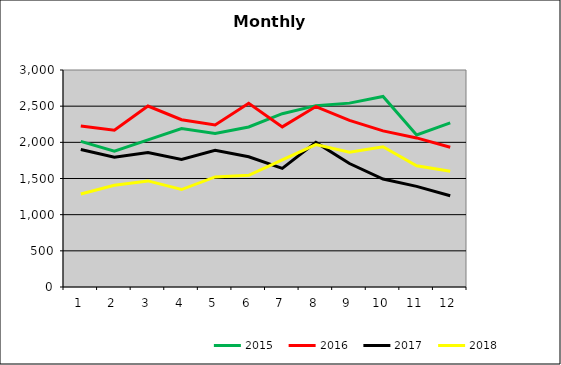
| Category | 2015 | 2016 | 2017 | 2018 |
|---|---|---|---|---|
| 0 | 2012.541 | 2226.188 | 1900.859 | 1286.21 |
| 1 | 1876.319 | 2166.497 | 1795.105 | 1406.556 |
| 2 | 2033.639 | 2501.903 | 1859.386 | 1466.695 |
| 3 | 2190.038 | 2312.349 | 1764.013 | 1347.408 |
| 4 | 2122.18 | 2240.561 | 1891.399 | 1522.181 |
| 5 | 2212.445 | 2540.235 | 1800.236 | 1543.945 |
| 6 | 2396.234 | 2213.485 | 1640.121 | 1758.013 |
| 7 | 2507.021 | 2494.361 | 1999.331 | 1969.207 |
| 8 | 2542.091 | 2304.009 | 1706.874 | 1861.88 |
| 9 | 2633.621 | 2158.544 | 1492.036 | 1938.743 |
| 10 | 2103.155 | 2060.966 | 1390.86 | 1676.82 |
| 11 | 2268.667 | 1932.97 | 1261.902 | 1598.863 |